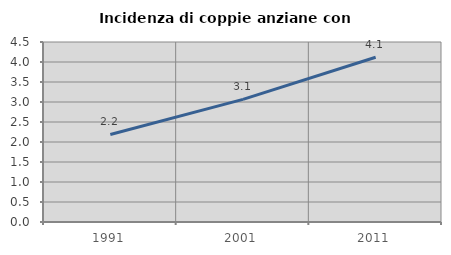
| Category | Incidenza di coppie anziane con figli |
|---|---|
| 1991.0 | 2.189 |
| 2001.0 | 3.065 |
| 2011.0 | 4.119 |